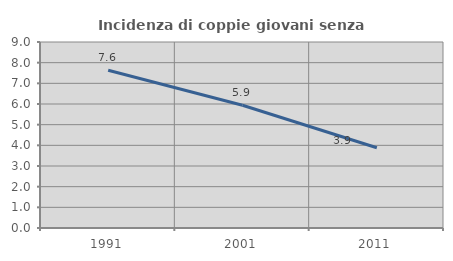
| Category | Incidenza di coppie giovani senza figli |
|---|---|
| 1991.0 | 7.636 |
| 2001.0 | 5.937 |
| 2011.0 | 3.883 |